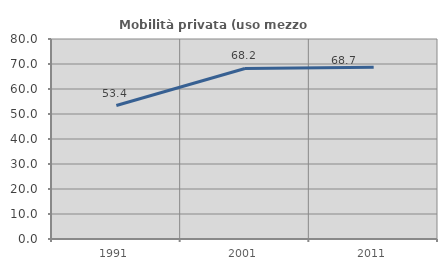
| Category | Mobilità privata (uso mezzo privato) |
|---|---|
| 1991.0 | 53.4 |
| 2001.0 | 68.219 |
| 2011.0 | 68.729 |